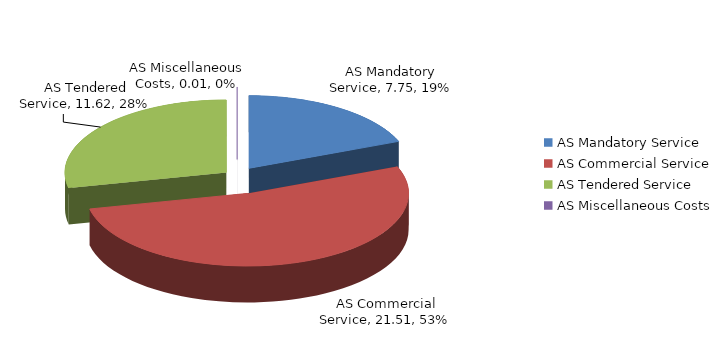
| Category | Series 0 |
|---|---|
| AS Mandatory Service | 7.746 |
| AS Commercial Service | 21.509 |
| AS Tendered Service | 11.622 |
| AS Miscellaneous Costs | 0.005 |